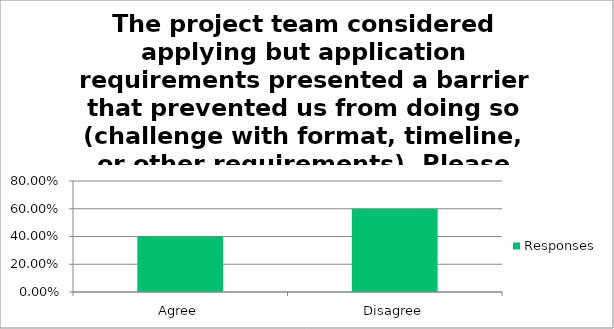
| Category | Responses |
|---|---|
| Agree | 0.4 |
| Disagree | 0.6 |